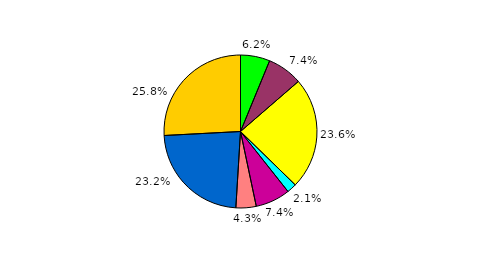
| Category | Series 0 |
|---|---|
| 0 | 6.216 |
| 1 | 7.437 |
| 2 | 23.644 |
| 3 | 2.046 |
| 4 | 7.346 |
| 5 | 4.283 |
| 6 | 23.192 |
| 7 | 25.836 |